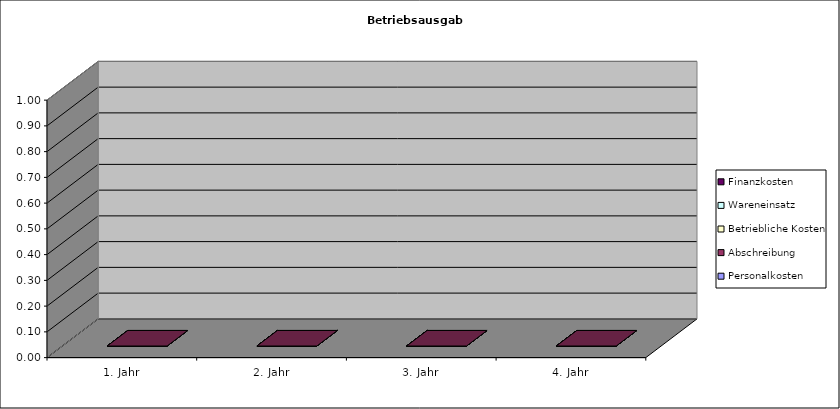
| Category | Personalkosten | Abschreibung | Betriebliche Kosten | Wareneinsatz | Finanzkosten |
|---|---|---|---|---|---|
| 1. Jahr | 0 | 0 | 0 | 0 | 0 |
| 2. Jahr | 0 | 0 | 0 | 0 | 0 |
| 3. Jahr | 0 | 0 | 0 | 0 | 0 |
| 4. Jahr | 0 | 0 | 0 | 0 | 0 |